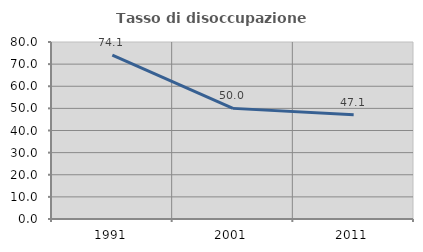
| Category | Tasso di disoccupazione giovanile  |
|---|---|
| 1991.0 | 74.074 |
| 2001.0 | 50 |
| 2011.0 | 47.126 |